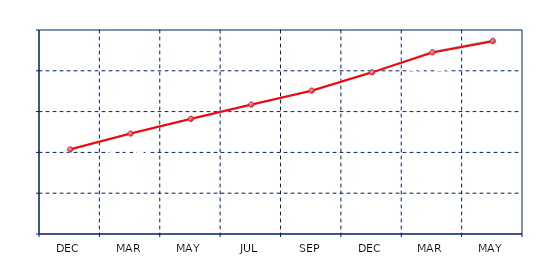
| Category | Series 0 | Series 1 |
|---|---|---|
| DEC | 341.25 | 341.5 |
| MAR | 349.25 | 349.25 |
| MAY | 356.25 | 356.5 |
| JUL | 363.25 | 363.5 |
| SEP | 370.375 | 370.25 |
| DEC | 379.25 | 379.25 |
| MAR | 389.25 | 389 |
| MAY | 394.875 | 394.5 |